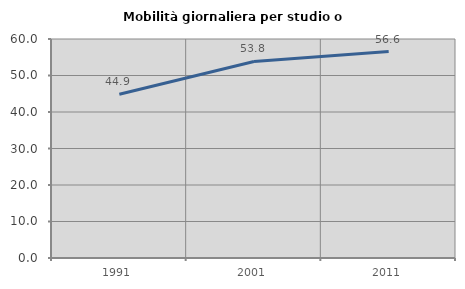
| Category | Mobilità giornaliera per studio o lavoro |
|---|---|
| 1991.0 | 44.855 |
| 2001.0 | 53.846 |
| 2011.0 | 56.561 |